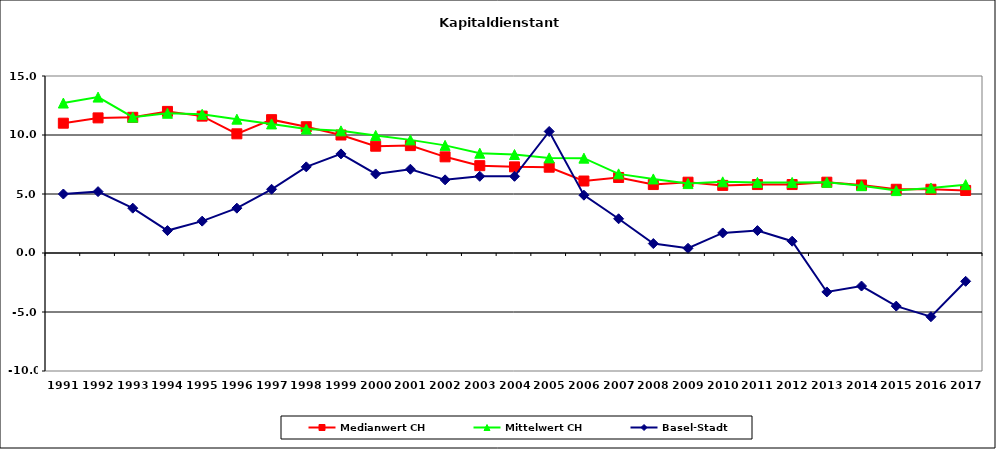
| Category | Medianwert CH | Mittelwert CH | Basel-Stadt |
|---|---|---|---|
| 1991.0 | 11 | 12.709 | 5 |
| 1992.0 | 11.45 | 13.212 | 5.2 |
| 1993.0 | 11.5 | 11.512 | 3.8 |
| 1994.0 | 12 | 11.842 | 1.9 |
| 1995.0 | 11.6 | 11.756 | 2.7 |
| 1996.0 | 10.1 | 11.342 | 3.8 |
| 1997.0 | 11.3 | 10.938 | 5.4 |
| 1998.0 | 10.7 | 10.5 | 7.3 |
| 1999.0 | 10 | 10.35 | 8.4 |
| 2000.0 | 9.05 | 9.964 | 6.7 |
| 2001.0 | 9.1 | 9.588 | 7.1 |
| 2002.0 | 8.15 | 9.121 | 6.2 |
| 2003.0 | 7.4 | 8.458 | 6.5 |
| 2004.0 | 7.3 | 8.345 | 6.5 |
| 2005.0 | 7.27 | 8.061 | 10.3 |
| 2006.0 | 6.1 | 8.039 | 4.9 |
| 2007.0 | 6.4 | 6.706 | 2.9 |
| 2008.0 | 5.8 | 6.277 | 0.8 |
| 2009.0 | 6 | 5.883 | 0.4 |
| 2010.0 | 5.73 | 6.031 | 1.7 |
| 2011.0 | 5.8 | 5.983 | 1.9 |
| 2012.0 | 5.8 | 5.983 | 1 |
| 2013.0 | 6 | 5.994 | -3.3 |
| 2014.0 | 5.765 | 5.705 | -2.8 |
| 2015.0 | 5.4 | 5.288 | -4.5 |
| 2016.0 | 5.4 | 5.51 | -5.4 |
| 2017.0 | 5.3 | 5.792 | -2.4 |